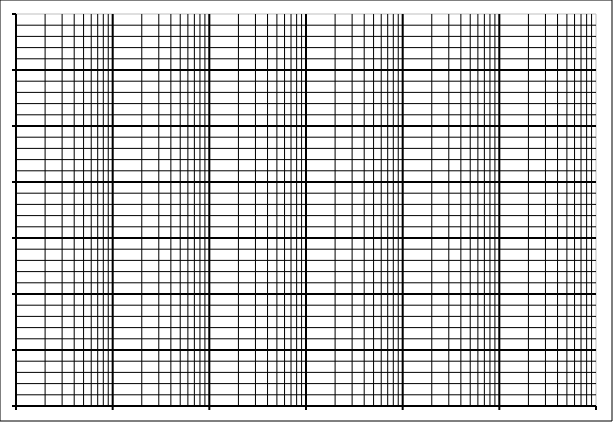
| Category | Series 0 |
|---|---|
| 0.001 | 60 |
| 0.002 | 60 |
| 0.005 | 60 |
| 0.01 | 60 |
| 0.02 | 60 |
| 0.05 | 60 |
| 0.1 | 60 |
| 0.2 | 60 |
| 0.5 | 60 |
| 1.0 | 60 |
| 2.0 | 60 |
| 5.0 | 60 |
| 10.0 | 60 |
| 20.0 | 60 |
| 50.0 | 60 |
| 100.0 | 60 |
| 200.0 | 60 |
| 500.0 | 60 |
| 1000.0 | 60 |
| 2000.0 | 60 |
| 5000.0 | 60 |
| 10000.0 | 60 |
| 20000.0 | 60 |
| 50000.0 | 60 |
| 100000.0 | 60 |
| 200000.0 | 60 |
| 500000.0 | 60 |
| 1000000.0 | 60 |
| 2000000.0 | 60 |
| 5000000.0 | 60 |
| 10000000.0 | 60 |